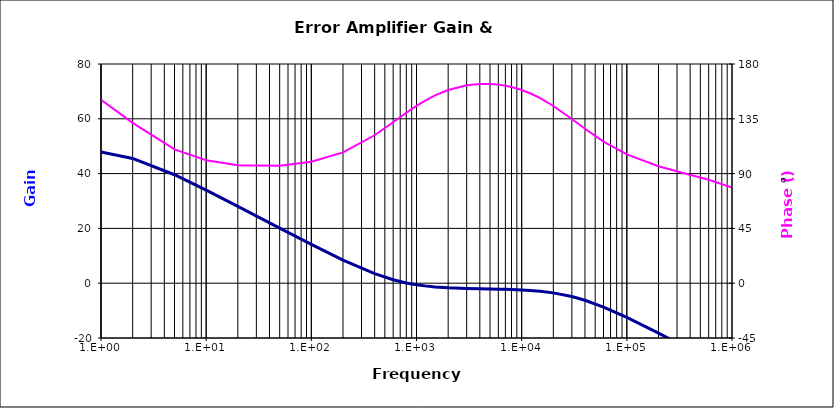
| Category | Error Amplifier Gain |
|---|---|
| 1.0 | 47.915 |
| 2.0 | 45.545 |
| 5.0 | 39.585 |
| 10.0 | 33.944 |
| 20.0 | 28.027 |
| 50.0 | 20.118 |
| 100.0 | 14.18 |
| 200.0 | 8.459 |
| 400.0 | 3.462 |
| 600.0 | 1.243 |
| 800.0 | 0.089 |
| 1000.0 | -0.572 |
| 1200.0 | -0.979 |
| 1500.0 | -1.344 |
| 2000.0 | -1.656 |
| 3000.0 | -1.909 |
| 4000.0 | -2.023 |
| 5000.0 | -2.1 |
| 6000.0 | -2.169 |
| 7000.0 | -2.236 |
| 8000.0 | -2.306 |
| 9000.0 | -2.381 |
| 10000.0 | -2.462 |
| 12000.0 | -2.638 |
| 15000.0 | -2.941 |
| 20000.0 | -3.527 |
| 30000.0 | -4.859 |
| 40000.0 | -6.226 |
| 60000.0 | -8.708 |
| 100000.0 | -12.499 |
| 200000.0 | -18.222 |
| 350000.0 | -23.031 |
| 600000.0 | -27.746 |
| 1000000.0 | -32.324 |